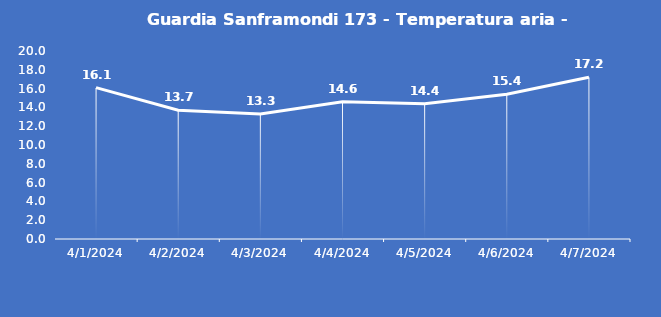
| Category | Guardia Sanframondi 173 - Temperatura aria - Grezzo (°C) |
|---|---|
| 4/1/24 | 16.1 |
| 4/2/24 | 13.7 |
| 4/3/24 | 13.3 |
| 4/4/24 | 14.6 |
| 4/5/24 | 14.4 |
| 4/6/24 | 15.4 |
| 4/7/24 | 17.2 |